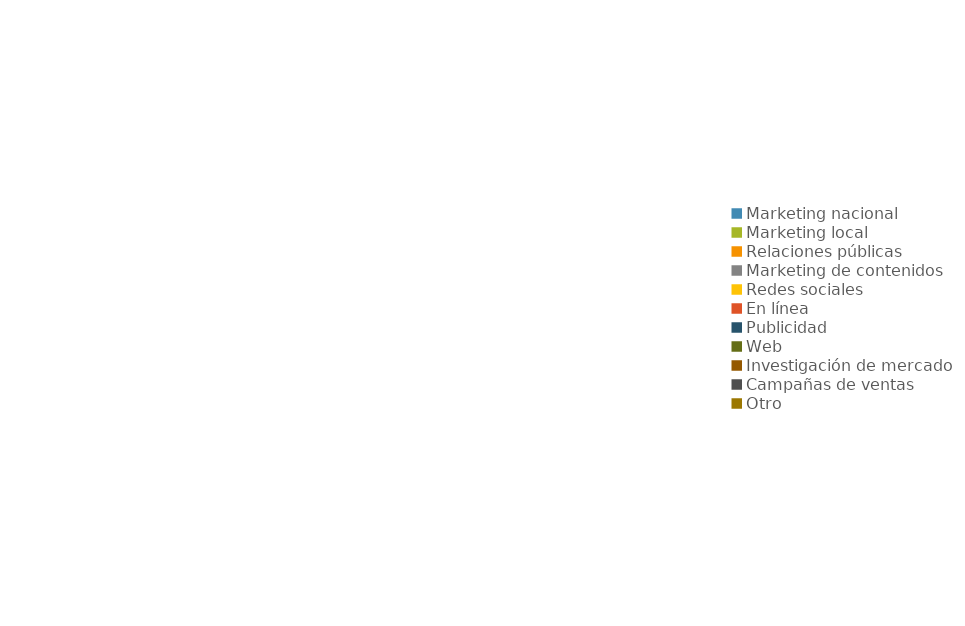
| Category | Series 0 | Series 1 |
|---|---|---|
| Marketing nacional | 0 | 0 |
| Marketing local | 0 | 0 |
| Relaciones públicas | 0 | 0 |
| Marketing de contenidos | 0 | 0 |
| Redes sociales | 0 | 0 |
| En línea | 0 | 0 |
| Publicidad | 0 | 0 |
| Web | 0 | 0 |
| Investigación de mercado | 0 | 0 |
| Campañas de ventas | 0 | 0 |
| Otro | 0 | 0 |